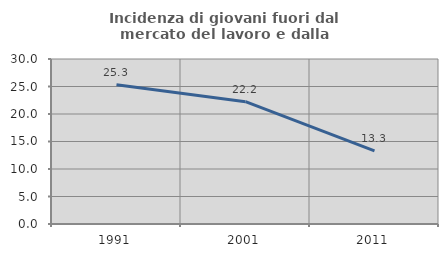
| Category | Incidenza di giovani fuori dal mercato del lavoro e dalla formazione  |
|---|---|
| 1991.0 | 25.309 |
| 2001.0 | 22.244 |
| 2011.0 | 13.308 |